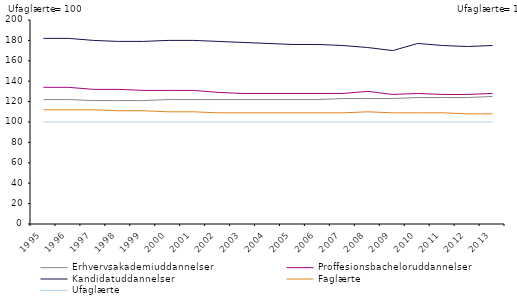
| Category | Erhvervsakademiuddannelser | Proffesionsbacheloruddannelser | Kandidatuddannelser | Faglærte | Ufaglærte |
|---|---|---|---|---|---|
| 1995.0 | 122 | 134 | 182 | 112 | 100 |
| 1996.0 | 122 | 134 | 182 | 112 | 100 |
| 1997.0 | 121 | 132 | 180 | 112 | 100 |
| 1998.0 | 121 | 132 | 179 | 111 | 100 |
| 1999.0 | 121 | 131 | 179 | 111 | 100 |
| 2000.0 | 122 | 131 | 180 | 110 | 100 |
| 2001.0 | 122 | 131 | 180 | 110 | 100 |
| 2002.0 | 122 | 129 | 179 | 109 | 100 |
| 2003.0 | 122 | 128 | 178 | 109 | 100 |
| 2004.0 | 122 | 128 | 177 | 109 | 100 |
| 2005.0 | 122 | 128 | 176 | 109 | 100 |
| 2006.0 | 122 | 128 | 176 | 109 | 100 |
| 2007.0 | 123 | 128 | 175 | 109 | 100 |
| 2008.0 | 123 | 130 | 173 | 110 | 100 |
| 2009.0 | 123 | 127 | 170 | 109 | 100 |
| 2010.0 | 124 | 128 | 177 | 109 | 100 |
| 2011.0 | 124 | 127 | 175 | 109 | 100 |
| 2012.0 | 124 | 127 | 174 | 108 | 100 |
| 2013.0 | 125 | 128 | 175 | 108 | 100 |